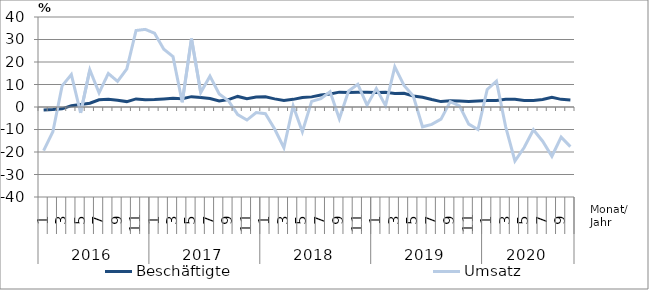
| Category | Beschäftigte | Umsatz |
|---|---|---|
| 0 | -1.3 | -19.4 |
| 1 | -1.1 | -11 |
| 2 | -0.8 | 9.4 |
| 3 | 0.6 | 14.4 |
| 4 | 1.1 | -2.6 |
| 5 | 1.7 | 16.5 |
| 6 | 3.2 | 6.3 |
| 7 | 3.4 | 14.9 |
| 8 | 3 | 11.4 |
| 9 | 2.4 | 16.9 |
| 10 | 3.6 | 34 |
| 11 | 3.2 | 34.5 |
| 12 | 3.3 | 32.8 |
| 13 | 3.6 | 25.7 |
| 14 | 3.9 | 22.4 |
| 15 | 3.7 | 2.1 |
| 16 | 4.6 | 30.4 |
| 17 | 4.2 | 6.4 |
| 18 | 3.8 | 13.7 |
| 19 | 2.7 | 5.8 |
| 20 | 3.3 | 2.8 |
| 21 | 4.7 | -3.4 |
| 22 | 3.7 | -5.8 |
| 23 | 4.4 | -2.5 |
| 24 | 4.5 | -3 |
| 25 | 3.6 | -9.8 |
| 26 | 2.9 | -18.1 |
| 27 | 3.4 | 0.5 |
| 28 | 4.2 | -11 |
| 29 | 4.5 | 2.5 |
| 30 | 5.3 | 3.7 |
| 31 | 5.8 | 6.8 |
| 32 | 6.6 | -5.2 |
| 33 | 6.5 | 7.1 |
| 34 | 6.6 | 10.1 |
| 35 | 6.6 | 0.8 |
| 36 | 6.4 | 8.2 |
| 37 | 6.5 | 0.6 |
| 38 | 6 | 17.8 |
| 39 | 6.1 | 9.6 |
| 40 | 4.9 | 4.9 |
| 41 | 4.3 | -8.8 |
| 42 | 3.3 | -7.7 |
| 43 | 2.4 | -5.4 |
| 44 | 2.8 | 2.4 |
| 45 | 2.7 | 0.5 |
| 46 | 2.5 | -7.6 |
| 47 | 2.7 | -10 |
| 48 | 2.9 | 7.8 |
| 49 | 2.9 | 11.5 |
| 50 | 3.4 | -8.8 |
| 51 | 3.4 | -24 |
| 52 | 2.9 | -18 |
| 53 | 2.9 | -10.1 |
| 54 | 3.3 | -15.2 |
| 55 | 4.3 | -21.9 |
| 56 | 3.4 | -13.4 |
| 57 | 3.1 | -17.6 |